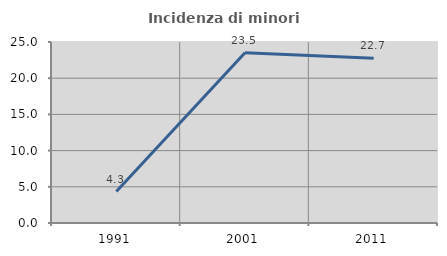
| Category | Incidenza di minori stranieri |
|---|---|
| 1991.0 | 4.348 |
| 2001.0 | 23.529 |
| 2011.0 | 22.747 |